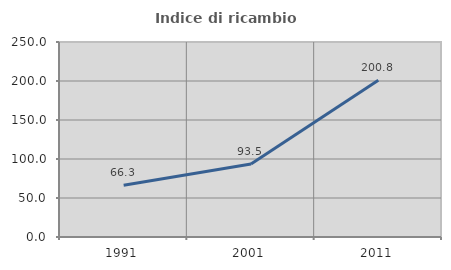
| Category | Indice di ricambio occupazionale  |
|---|---|
| 1991.0 | 66.275 |
| 2001.0 | 93.47 |
| 2011.0 | 200.823 |